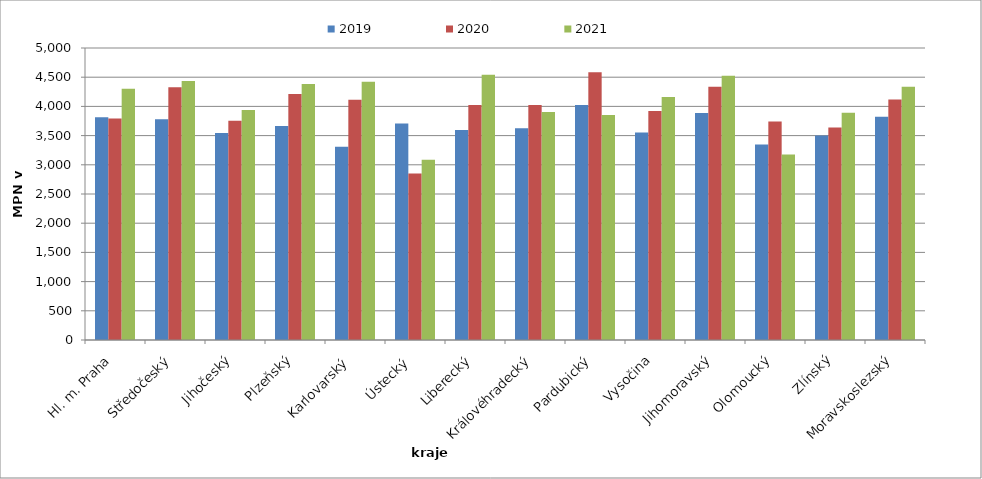
| Category | 2019 | 2020 | 2021 |
|---|---|---|---|
| Hl. m. Praha | 3815 | 3793 | 4302 |
| Středočeský | 3778 | 4328 | 4437 |
| Jihočeský | 3545 | 3753 | 3937 |
| Plzeňský | 3663 | 4214 | 4385 |
| Karlovarský  | 3311 | 4112 | 4421 |
| Ústecký   | 3708 | 2853 | 3086 |
| Liberecký | 3597 | 4022 | 4543 |
| Královéhradecký | 3626 | 4024 | 3905 |
| Pardubický | 4023 | 4586 | 3852 |
| Vysočina | 3555 | 3923 | 4163 |
| Jihomoravský | 3889 | 4337 | 4526 |
| Olomoucký | 3347 | 3742 | 3177 |
| Zlínský | 3502 | 3638 | 3893 |
| Moravskoslezský | 3822 | 4118 | 4338 |